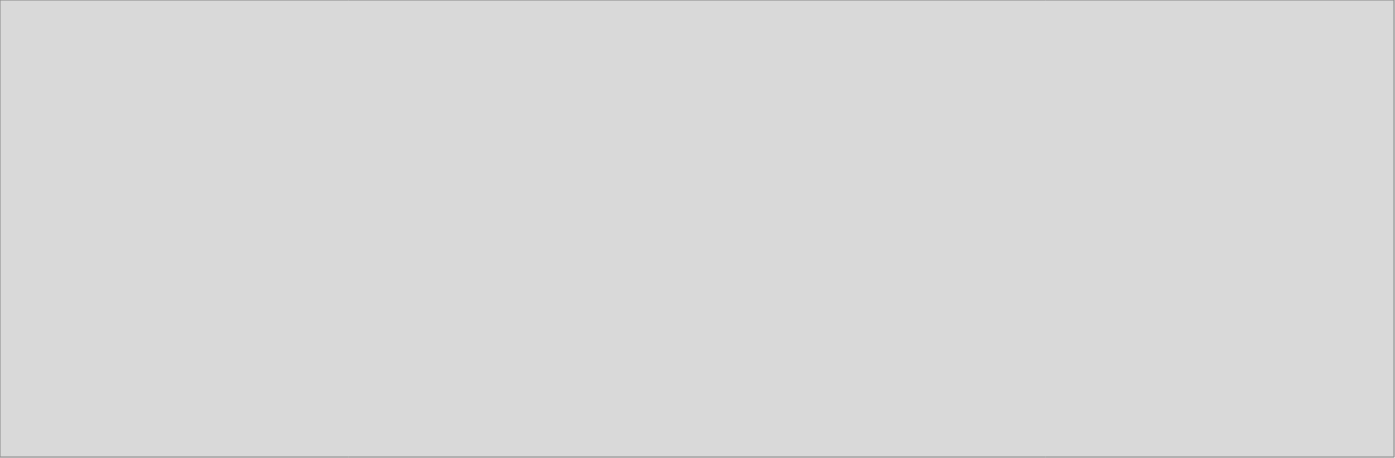
| Category | Administración pública y defensa; planes de seguridad social de afiliación obligatoria |
|---|---|
| 2018_I | 5613.263 |
| 2018_II | 6023.453 |
| 2018_III | 6503.799 |
| 2018_IV | 7508.505 |
| 2019_I | 5794.593 |
| 2019_II | 6305.765 |
| 2019_III | 0 |
| 2019_IV | 0 |